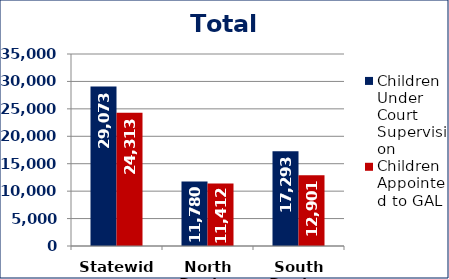
| Category | Children Under Court Supervision  | Children Appointed to GAL Program  |
|---|---|---|
| Statewide | 29073 | 24313 |
| North Region | 11780 | 11412 |
| South Region | 17293 | 12901 |